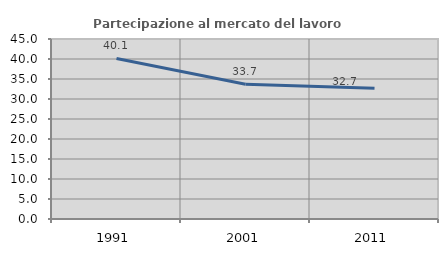
| Category | Partecipazione al mercato del lavoro  femminile |
|---|---|
| 1991.0 | 40.136 |
| 2001.0 | 33.682 |
| 2011.0 | 32.694 |